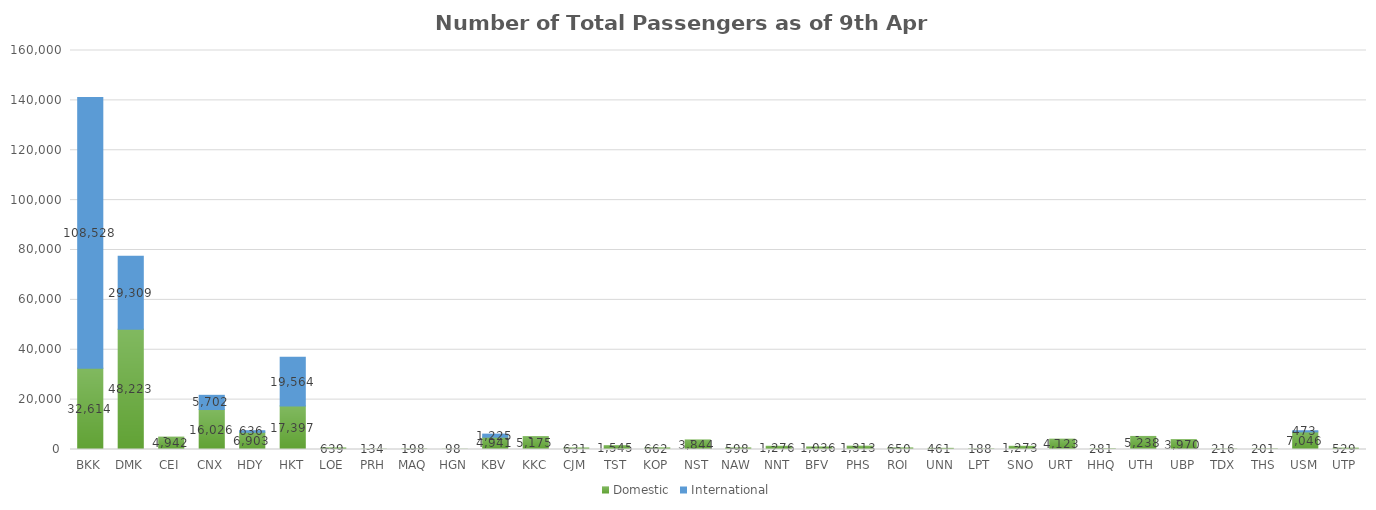
| Category | Domestic | International |
|---|---|---|
| BKK | 32614 | 108528 |
| DMK | 48223 | 29309 |
| CEI | 4942 | 0 |
| CNX | 16026 | 5702 |
| HDY | 6903 | 636 |
| HKT | 17397 | 19564 |
| LOE | 639 | 0 |
| PRH | 134 | 0 |
| MAQ | 198 | 0 |
| HGN | 98 | 0 |
| KBV | 4941 | 1225 |
| KKC | 5175 | 0 |
| CJM | 631 | 0 |
| TST | 1545 | 0 |
| KOP | 662 | 0 |
| NST | 3844 | 0 |
| NAW | 598 | 0 |
| NNT | 1276 | 0 |
| BFV | 1036 | 0 |
| PHS | 1313 | 0 |
| ROI | 650 | 0 |
| UNN | 461 | 0 |
| LPT | 188 | 0 |
| SNO | 1273 | 0 |
| URT | 4123 | 0 |
| HHQ | 281 | 0 |
| UTH | 5238 | 0 |
| UBP | 3970 | 0 |
| TDX | 216 | 0 |
| THS | 201 | 0 |
| USM | 7046 | 473 |
| UTP | 529 | 0 |